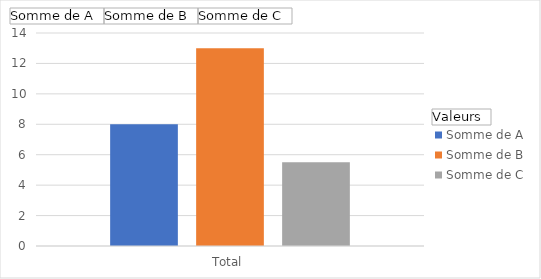
| Category | Somme de A | Somme de B | Somme de C |
|---|---|---|---|
| Total | 8 | 13 | 5.5 |